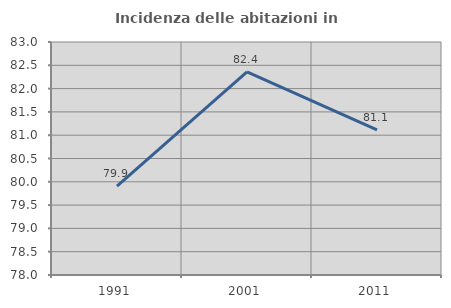
| Category | Incidenza delle abitazioni in proprietà  |
|---|---|
| 1991.0 | 79.907 |
| 2001.0 | 82.36 |
| 2011.0 | 81.115 |